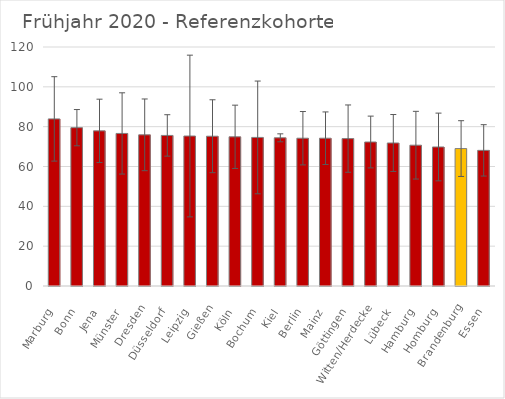
| Category | Mittelwert Ref |
|---|---|
| Marburg | 83.9 |
| Bonn | 79.5 |
| Jena | 77.9 |
| Münster | 76.6 |
| Dresden | 75.9 |
| Düsseldorf | 75.6 |
| Leipzig | 75.3 |
| Gießen | 75.2 |
| Köln | 74.9 |
| Bochum | 74.6 |
| Kiel | 74.4 |
| Berlin | 74.2 |
| Mainz | 74.2 |
| Göttingen | 74 |
| Witten/Herdecke | 72.3 |
| Lübeck | 71.8 |
| Hamburg | 70.7 |
| Homburg | 69.8 |
| Brandenburg | 69 |
| Essen | 68.1 |